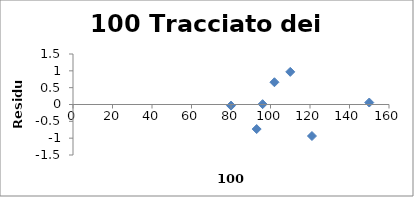
| Category | Series 0 |
|---|---|
| 80.0 | -0.033 |
| 93.0 | -0.73 |
| 102.0 | 0.661 |
| 110.0 | 0.969 |
| 121.0 | -0.936 |
| 96.0 | 0.01 |
| 150.0 | 0.059 |